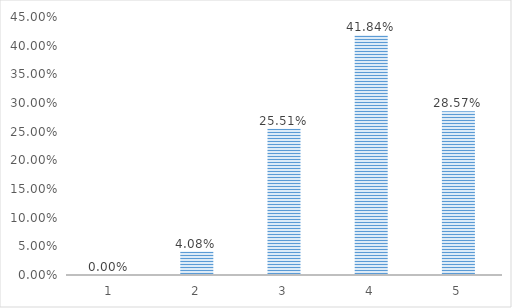
| Category | Series 0 |
|---|---|
| 1.0 | 0 |
| 2.0 | 0.041 |
| 3.0 | 0.255 |
| 4.0 | 0.418 |
| 5.0 | 0.286 |